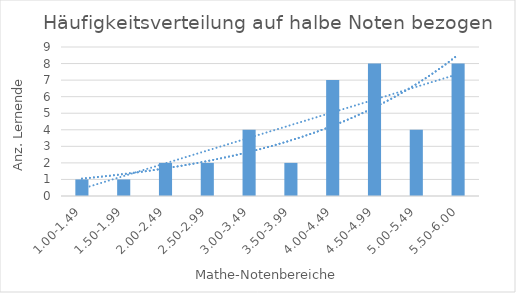
| Category | Series 0 |
|---|---|
| 1.00-1.49 | 1 |
| 1.50-1.99 | 1 |
| 2.00-2.49 | 2 |
| 2.50-2.99 | 2 |
| 3.00-3.49 | 4 |
| 3.50-3.99 | 2 |
| 4.00-4.49 | 7 |
| 4.50-4.99 | 8 |
| 5.00-5.49 | 4 |
| 5.50-6.00 | 8 |